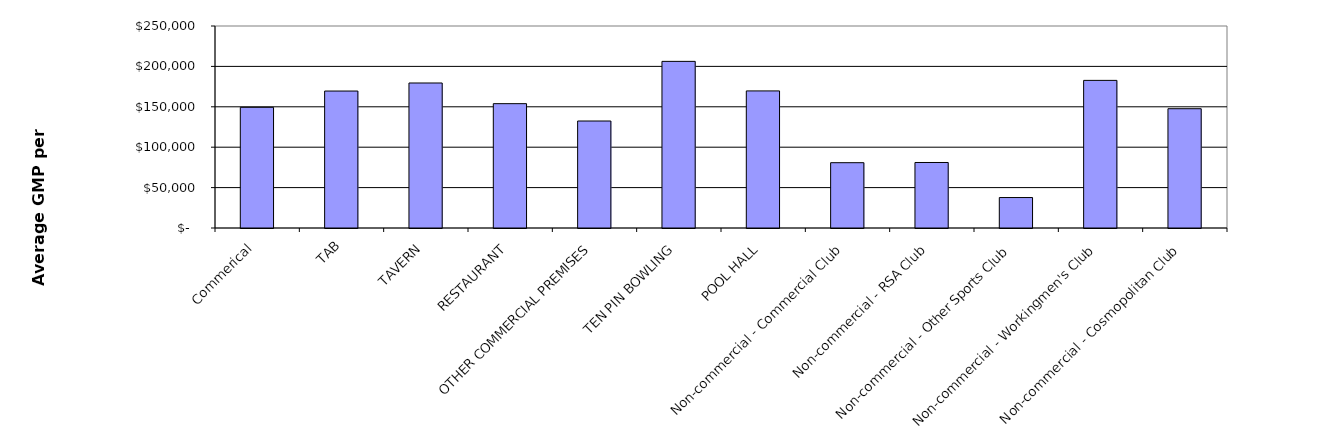
| Category | Series 0 |
|---|---|
| Commerical | 149354.677 |
| TAB | 169505.084 |
| TAVERN | 179464.945 |
| RESTAURANT | 153877.806 |
| OTHER COMMERCIAL PREMISES | 132414.393 |
| TEN PIN BOWLING | 206229.54 |
| POOL HALL | 169663.048 |
| Non-commercial - Commercial Club | 80828.265 |
| Non-commercial - RSA Club | 81081.512 |
| Non-commercial - Other Sports Club | 37695.556 |
| Non-commercial - Workingmen's Club | 182703.736 |
| Non-commercial - Cosmopolitan Club | 147644.315 |